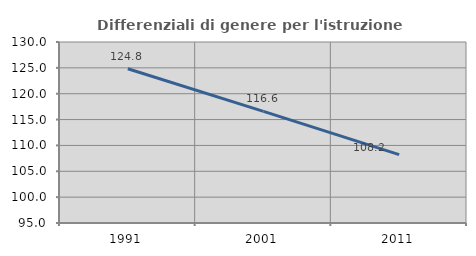
| Category | Differenziali di genere per l'istruzione superiore |
|---|---|
| 1991.0 | 124.83 |
| 2001.0 | 116.597 |
| 2011.0 | 108.225 |